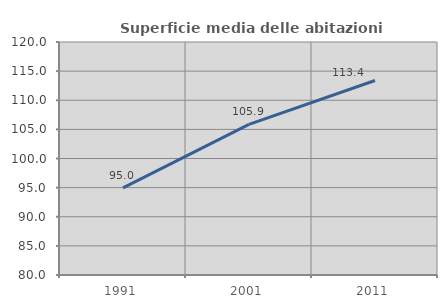
| Category | Superficie media delle abitazioni occupate |
|---|---|
| 1991.0 | 94.953 |
| 2001.0 | 105.865 |
| 2011.0 | 113.387 |